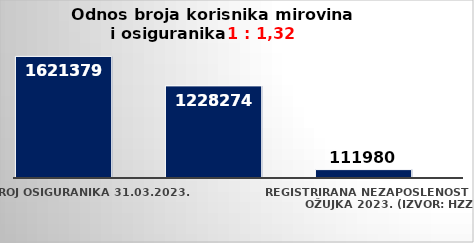
| Category | Series 0 | Series 1 |
|---|---|---|
| Broj osiguranika 31.03.2023. | 1621379 |  |
| Broj korisnika mirovine za ožujak 2023. (isplata u travnju 2023.) | 1228274 |  |
| Registrirana nezaposlenost krajem ožujka 2023. (izvor: HZZ) | 111980 |  |